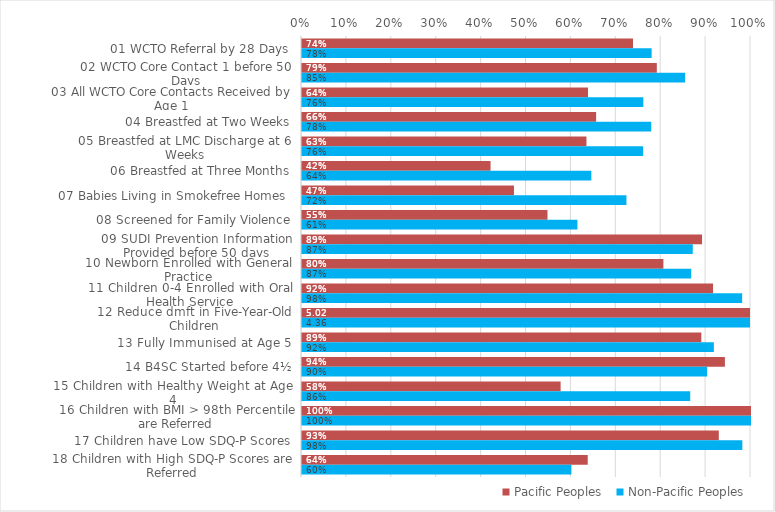
| Category | Pacific Peoples | Non-Pacific Peoples |
|---|---|---|
| 01 WCTO Referral by 28 Days | 0.737 | 0.779 |
| 02 WCTO Core Contact 1 before 50 Days | 0.79 | 0.853 |
| 03 All WCTO Core Contacts Received by Age 1 | 0.637 | 0.76 |
| 04 Breastfed at Two Weeks | 0.655 | 0.778 |
| 05 Breastfed at LMC Discharge at 6 Weeks | 0.634 | 0.76 |
| 06 Breastfed at Three Months | 0.42 | 0.644 |
| 07 Babies Living in Smokefree Homes  | 0.472 | 0.723 |
| 08 Screened for Family Violence | 0.547 | 0.613 |
| 09 SUDI Prevention Information Provided before 50 days | 0.891 | 0.87 |
| 10 Newborn Enrolled with General Practice | 0.805 | 0.867 |
| 11 Children 0-4 Enrolled with Oral Health Service | 0.915 | 0.98 |
| 12 Reduce dmft in Five-Year-Old Children | 5.024 | 4.363 |
| 13 Fully Immunised at Age 5 | 0.889 | 0.917 |
| 14 B4SC Started before 4½ | 0.942 | 0.902 |
| 15 Children with Healthy Weight at Age 4 | 0.576 | 0.865 |
| 16 Children with BMI > 98th Percentile are Referred | 1 | 1 |
| 17 Children have Low SDQ-P Scores | 0.928 | 0.981 |
| 18 Children with High SDQ-P Scores are Referred | 0.636 | 0.6 |